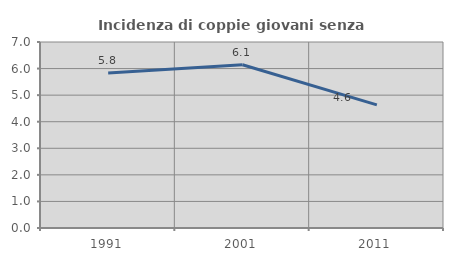
| Category | Incidenza di coppie giovani senza figli |
|---|---|
| 1991.0 | 5.834 |
| 2001.0 | 6.144 |
| 2011.0 | 4.633 |